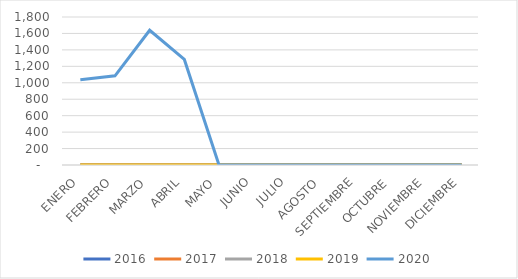
| Category | 2016 | 2017 | 2018 | 2019 | 2020 |
|---|---|---|---|---|---|
| ENERO | 0 | 0 | 0 | 0 | 1037.098 |
| FEBRERO | 0 | 0 | 0 | 0 | 1084.333 |
| MARZO | 0 | 0 | 0 | 0 | 1639.009 |
| ABRIL | 0 | 0 | 0 | 0 | 1283.859 |
| MAYO | 0 | 0 | 0 | 0 | 0 |
| JUNIO | 0 | 0 | 0 | 0 | 0 |
| JULIO | 0 | 0 | 0 | 0 | 0 |
| AGOSTO | 0 | 0 | 0 | 0 | 0 |
| SEPTIEMBRE | 0 | 0 | 0 | 0 | 0 |
| OCTUBRE | 0 | 0 | 0 | 0 | 0 |
| NOVIEMBRE | 0 | 0 | 0 | 0 | 0 |
| DICIEMBRE | 0 | 0 | 0 | 0 | 0 |